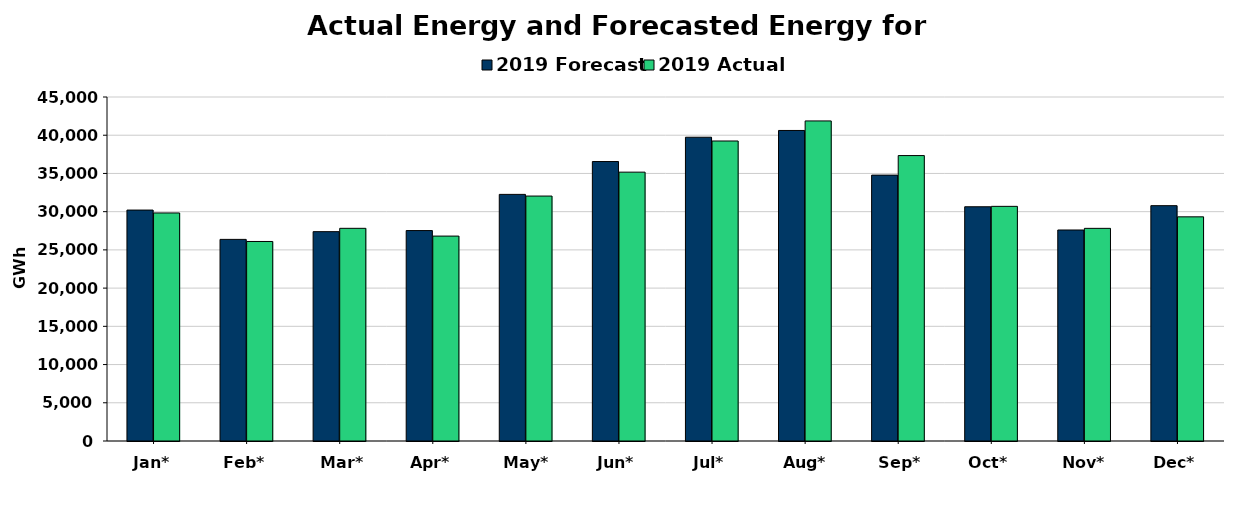
| Category | 2019 Forecast | 2019 Actual |
|---|---|---|
| Jan* | 30208 | 29830 |
| Feb* | 26375 | 26100 |
| Mar* | 27386 | 27821 |
| Apr* | 27528 | 26805 |
| May* | 32261 | 32042 |
| Jun* | 36557 | 35170 |
| Jul* | 39737 | 39246 |
| Aug* | 40622 | 41870 |
| Sep* | 34781 | 37338 |
| Oct* | 30643 | 30695 |
| Nov* | 27603 | 27818 |
| Dec* | 30785 | 29323 |